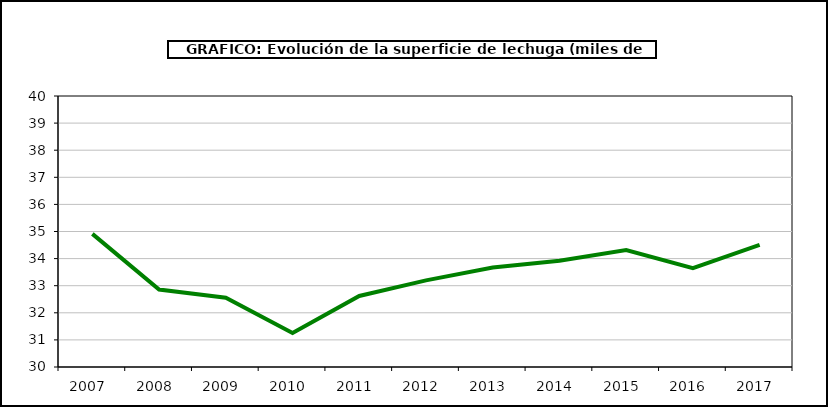
| Category | superficie |
|---|---|
| 2007.0 | 34.912 |
| 2008.0 | 32.86 |
| 2009.0 | 32.557 |
| 2010.0 | 31.256 |
| 2011.0 | 32.62 |
| 2012.0 | 33.196 |
| 2013.0 | 33.669 |
| 2014.0 | 33.924 |
| 2015.0 | 34.314 |
| 2016.0 | 33.646 |
| 2017.0 | 34.508 |